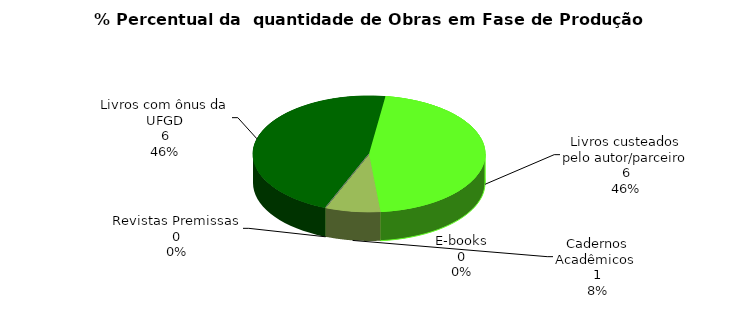
| Category | Series 0 |
|---|---|
| Livros com ônus da UFGD | 6 |
| Livros custeados pelo autor/parceiro | 6 |
| Cadernos Acadêmicos  | 1 |
| E-books | 0 |
| Revistas Premissas | 0 |